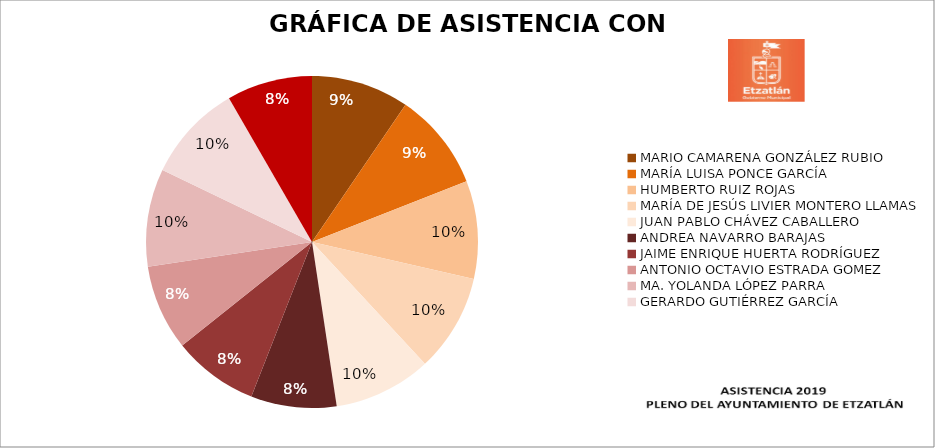
| Category | Series 0 |
|---|---|
| MARIO CAMARENA GONZÁLEZ RUBIO | 100 |
| MARÍA LUISA PONCE GARCÍA | 100 |
| HUMBERTO RUIZ ROJAS | 100 |
| MARÍA DE JESÚS LIVIER MONTERO LLAMAS | 100 |
| JUAN PABLO CHÁVEZ CABALLERO | 100 |
| ANDREA NAVARRO BARAJAS | 87.5 |
| JAIME ENRIQUE HUERTA RODRÍGUEZ | 87.5 |
| ANTONIO OCTAVIO ESTRADA GOMEZ | 87.5 |
| MA. YOLANDA LÓPEZ PARRA | 100 |
| GERARDO GUTIÉRREZ GARCÍA | 100 |
| ALEJANDRA JIMÉNEZ ZEPEDA | 87.5 |